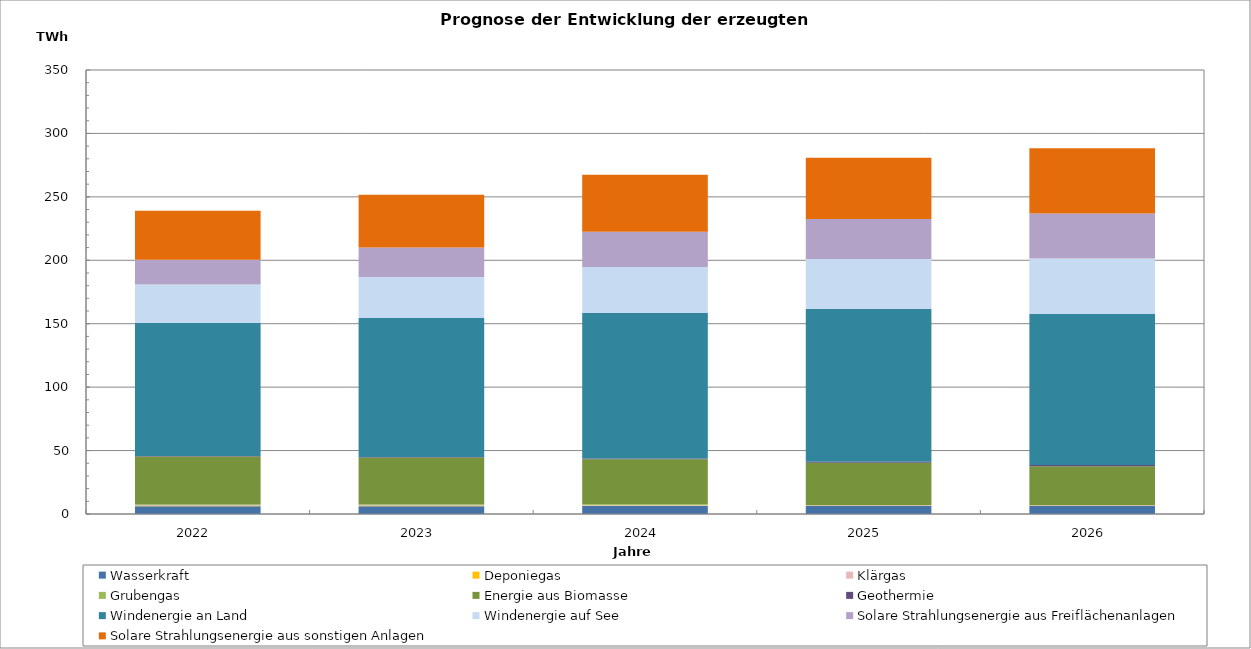
| Category | Wasserkraft | Deponiegas | Klärgas | Grubengas | Energie aus Biomasse | Geothermie | Windenergie an Land | Windenergie auf See | Solare Strahlungsenergie aus Freiflächenanlagen | Solare Strahlungsenergie aus sonstigen Anlagen |
|---|---|---|---|---|---|---|---|---|---|---|
| 2022.0 | 6174.431 | 197.872 | 432.793 | 777.079 | 37810.238 | 347.511 | 104914.812 | 30205.086 | 19526.254 | 38711.805 |
| 2023.0 | 6207.057 | 188.342 | 435.86 | 769.308 | 36841.437 | 492.752 | 109486.929 | 32320.589 | 23278.504 | 41728.64 |
| 2024.0 | 6239.683 | 177.887 | 438.922 | 761.615 | 35577.631 | 651.95 | 114695.823 | 36244.277 | 27668.687 | 44936.585 |
| 2025.0 | 6272.31 | 165.366 | 441.996 | 53.002 | 33520.187 | 831.151 | 120341.688 | 39353.894 | 31654.83 | 48171.543 |
| 2026.0 | 6304.936 | 157.588 | 445.063 | 29.842 | 30611.006 | 1027.104 | 119110.204 | 43803.742 | 35467.883 | 51392.787 |